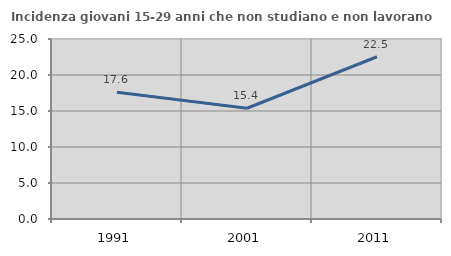
| Category | Incidenza giovani 15-29 anni che non studiano e non lavorano  |
|---|---|
| 1991.0 | 17.593 |
| 2001.0 | 15.385 |
| 2011.0 | 22.535 |